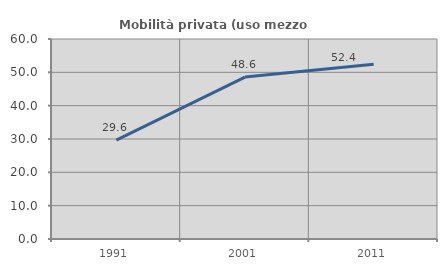
| Category | Mobilità privata (uso mezzo privato) |
|---|---|
| 1991.0 | 29.644 |
| 2001.0 | 48.571 |
| 2011.0 | 52.414 |